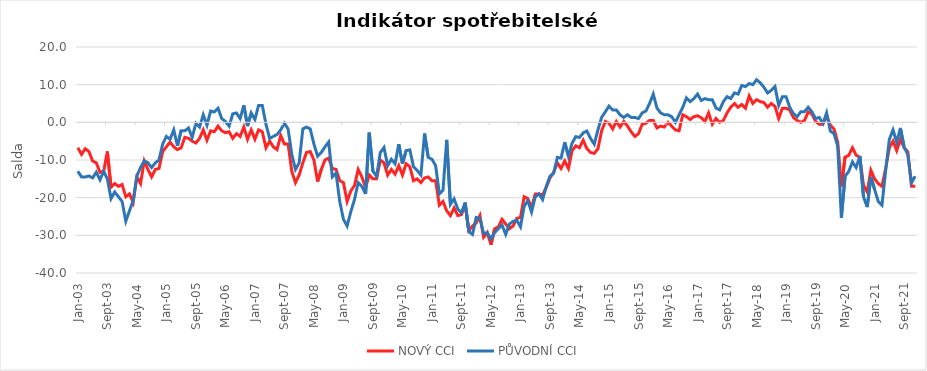
| Category | NOVÝ CCI | PŮVODNÍ CCI |
|---|---|---|
| 2003-01-01 | -6.75 | -13 |
| 2003-02-01 | -8.5 | -14.5 |
| 2003-03-01 | -7 | -14.5 |
| 2003-04-01 | -7.75 | -14.25 |
| 2003-05-01 | -10.25 | -14.75 |
| 2003-06-01 | -10.75 | -13.25 |
| 2003-07-01 | -13.25 | -15.25 |
| 2003-08-01 | -13 | -13 |
| 2003-09-01 | -7.75 | -15 |
| 2003-10-01 | -17.25 | -20.25 |
| 2003-11-01 | -16.25 | -18.5 |
| 2003-12-01 | -17 | -19.75 |
| 2004-01-01 | -16.5 | -21 |
| 2004-02-01 | -19.75 | -26.25 |
| 2004-03-01 | -19 | -23.5 |
| 2004-04-01 | -21.25 | -20.75 |
| 2004-05-01 | -14.5 | -14.25 |
| 2004-06-01 | -16.25 | -12 |
| 2004-07-01 | -10.25 | -10.25 |
| 2004-08-01 | -12.5 | -10.75 |
| 2004-09-01 | -14.5 | -12 |
| 2004-10-01 | -12.5 | -10.75 |
| 2004-11-01 | -12.25 | -10 |
| 2004-12-01 | -7.75 | -5.75 |
| 2005-01-01 | -6.5 | -3.75 |
| 2005-02-01 | -5.25 | -4.5 |
| 2005-03-01 | -6.5 | -2 |
| 2005-04-01 | -7.25 | -6.25 |
| 2005-05-01 | -6.75 | -2.25 |
| 2005-06-01 | -4 | -2.25 |
| 2005-07-01 | -4.25 | -1.5 |
| 2005-08-01 | -5 | -4 |
| 2005-09-01 | -5.5 | -0.25 |
| 2005-10-01 | -4.25 | -1.25 |
| 2005-11-01 | -2 | 2 |
| 2005-12-01 | -4.75 | -0.75 |
| 2006-01-01 | -2.25 | 3 |
| 2006-02-01 | -2.5 | 2.75 |
| 2006-03-01 | -1 | 3.75 |
| 2006-04-01 | -2.25 | 1 |
| 2006-05-01 | -2.75 | 0.25 |
| 2006-06-01 | -2.5 | -1 |
| 2006-07-01 | -4.25 | 2.25 |
| 2006-08-01 | -3 | 2.5 |
| 2006-09-01 | -3.75 | 1 |
| 2006-10-01 | -1.25 | 4.5 |
| 2006-11-01 | -4.5 | -1 |
| 2006-12-01 | -2 | 2.5 |
| 2007-01-01 | -4.5 | 0.75 |
| 2007-02-01 | -2 | 4.5 |
| 2007-03-01 | -2.5 | 4.5 |
| 2007-04-01 | -6.75 | -0.5 |
| 2007-05-01 | -5 | -4.25 |
| 2007-06-01 | -6.5 | -3.75 |
| 2007-07-01 | -7.25 | -3.25 |
| 2007-08-01 | -3.5 | -2 |
| 2007-09-01 | -5.75 | -0.25 |
| 2007-10-01 | -5.75 | -1.75 |
| 2007-11-01 | -13 | -8.5 |
| 2007-12-01 | -16 | -12.5 |
| 2008-01-01 | -14 | -10.75 |
| 2008-02-01 | -10.75 | -1.75 |
| 2008-03-01 | -8 | -1.25 |
| 2008-04-01 | -7.75 | -1.75 |
| 2008-05-01 | -10 | -5.75 |
| 2008-06-01 | -15.75 | -9 |
| 2008-07-01 | -12.5 | -8 |
| 2008-08-01 | -10 | -6.5 |
| 2008-09-01 | -9.5 | -5.25 |
| 2008-10-01 | -12.25 | -14.5 |
| 2008-11-01 | -12.5 | -13.5 |
| 2008-12-01 | -15.5 | -21 |
| 2009-01-01 | -16 | -25.75 |
| 2009-02-01 | -21 | -27.5 |
| 2009-03-01 | -18.25 | -23.75 |
| 2009-04-01 | -16.75 | -20.5 |
| 2009-05-01 | -12.5 | -16 |
| 2009-06-01 | -14.5 | -17 |
| 2009-07-01 | -17.25 | -19 |
| 2009-08-01 | -14 | -2.75 |
| 2009-09-01 | -15 | -13 |
| 2009-10-01 | -15 | -14.3 |
| 2009-11-01 | -10 | -8 |
| 2009-12-01 | -10.75 | -6.7 |
| 2010-01-01 | -14 | -11.5 |
| 2010-02-01 | -12.5 | -9.8 |
| 2010-03-01 | -13.75 | -11 |
| 2010-04-01 | -11.5 | -5.8 |
| 2010-05-01 | -14 | -11 |
| 2010-06-01 | -11 | -7.5 |
| 2010-07-01 | -11.75 | -7.3 |
| 2010-08-01 | -15.5 | -11.8 |
| 2010-09-01 | -15 | -12.8 |
| 2010-10-01 | -16 | -14 |
| 2010-11-01 | -14.75 | -2.984 |
| 2010-12-01 | -14.5 | -9.3 |
| 2011-01-01 | -15.5 | -9.8 |
| 2011-02-01 | -15.5 | -11.5 |
| 2011-03-01 | -22 | -19 |
| 2011-04-01 | -21 | -18 |
| 2011-05-01 | -23.5 | -4.656 |
| 2011-06-01 | -24.75 | -21.8 |
| 2011-07-01 | -22.75 | -20.3 |
| 2011-08-01 | -24.75 | -23 |
| 2011-09-01 | -24.5 | -24 |
| 2011-10-01 | -21.75 | -21.3 |
| 2011-11-01 | -28.75 | -29 |
| 2011-12-01 | -27.5 | -29.75 |
| 2012-01-01 | -26.75 | -25.25 |
| 2012-02-01 | -24.75 | -25.5 |
| 2012-03-01 | -30.5 | -29.5 |
| 2012-04-01 | -29.25 | -29.3 |
| 2012-05-01 | -32.5 | -31 |
| 2012-06-01 | -28.25 | -29.25 |
| 2012-07-01 | -27.75 | -28.25 |
| 2012-08-01 | -25.75 | -27.25 |
| 2012-09-01 | -27 | -29.75 |
| 2012-10-01 | -28.25 | -27 |
| 2012-11-01 | -27.5 | -26.3 |
| 2012-12-01 | -25.5 | -26 |
| 2013-01-01 | -25.25 | -27.75 |
| 2013-02-01 | -19.75 | -22.3 |
| 2013-03-01 | -20.25 | -20.8 |
| 2013-04-01 | -22.75 | -23.8 |
| 2013-05-01 | -19 | -19.8 |
| 2013-06-01 | -19 | -19 |
| 2013-07-01 | -19.25 | -20.5 |
| 2013-08-01 | -17.25 | -17 |
| 2013-09-01 | -14.75 | -14.3 |
| 2013-10-01 | -13.25 | -13.5 |
| 2013-11-01 | -10.75 | -9.3 |
| 2013-12-01 | -12.25 | -9.5 |
| 2014-01-01 | -10.25 | -5.3 |
| 2014-02-01 | -12.25 | -9 |
| 2014-03-01 | -7.5 | -5.5 |
| 2014-04-01 | -6.25 | -3.8 |
| 2014-05-01 | -6.75 | -4 |
| 2014-06-01 | -4.75 | -2.8 |
| 2014-07-01 | -7 | -2.3 |
| 2014-08-01 | -8 | -4.3 |
| 2014-09-01 | -8.25 | -5.8 |
| 2014-10-01 | -7 | -2 |
| 2014-11-01 | -2.25 | 1.3 |
| 2014-12-01 | 0.25 | 2.8 |
| 2015-01-01 | -0.25 | 4.3 |
| 2015-02-01 | -1.75 | 3.3 |
| 2015-03-01 | 0.25 | 3.3 |
| 2015-04-01 | -1.25 | 2 |
| 2015-05-01 | 0.25 | 1.3 |
| 2015-06-01 | -1 | 2 |
| 2015-07-01 | -2.5 | 1.3 |
| 2015-08-01 | -3.75 | 1.3 |
| 2015-09-01 | -3 | 1 |
| 2015-10-01 | -0.5 | 2.5 |
| 2015-11-01 | -0.25 | 3 |
| 2015-12-01 | 0.5 | 5 |
| 2016-01-01 | 0.5 | 7.5 |
| 2016-02-01 | -1.5 | 3.8 |
| 2016-03-01 | -1 | 2.5 |
| 2016-04-01 | -1.25 | 2 |
| 2016-05-01 | 0 | 2 |
| 2016-06-01 | -1 | 1.5 |
| 2016-07-01 | -2 | 0 |
| 2016-08-01 | -2.25 | 2 |
| 2016-09-01 | 2 | 4 |
| 2016-10-01 | 1.5 | 6.5 |
| 2016-11-01 | 0.75 | 5.5 |
| 2016-12-01 | 1.5 | 6.3 |
| 2017-01-01 | 1.75 | 7.5 |
| 2017-02-01 | 1.25 | 5.8 |
| 2017-03-01 | 0.25 | 6.3 |
| 2017-04-01 | 2.5 | 6 |
| 2017-05-01 | -0.5 | 6 |
| 2017-06-01 | 1 | 3.8 |
| 2017-07-01 | 0 | 3.3 |
| 2017-08-01 | 0.5 | 5.5 |
| 2017-09-01 | 2.5 | 6.8 |
| 2017-10-01 | 4 | 6.3 |
| 2017-11-01 | 5 | 7.8 |
| 2017-12-01 | 4 | 7.5 |
| 2018-01-01 | 4.75 | 9.8 |
| 2018-02-01 | 3.75 | 9.5 |
| 2018-03-01 | 7 | 10.3 |
| 2018-04-01 | 5 | 10 |
| 2018-05-01 | 6 | 11.3 |
| 2018-06-01 | 5.5 | 10.5 |
| 2018-07-01 | 5.25 | 9.3 |
| 2018-08-01 | 4 | 7.8 |
| 2018-09-01 | 5 | 8.5 |
| 2018-10-01 | 4.25 | 9.5 |
| 2018-11-01 | 1 | 4.5 |
| 2018-12-01 | 3.75 | 6.8 |
| 2019-01-01 | 3.75 | 6.8 |
| 2019-02-01 | 3.25 | 4 |
| 2019-03-01 | 1.25 | 2.3 |
| 2019-04-01 | 0.5 | 1.5 |
| 2019-05-01 | 0 | 2.8 |
| 2019-06-01 | 0.5 | 2.8 |
| 2019-07-01 | 2.75 | 4 |
| 2019-08-01 | 2.25 | 2.8 |
| 2019-09-01 | 0.25 | 1 |
| 2019-10-01 | -0.5 | 1.3 |
| 2019-11-01 | -0.5 | -0.3 |
| 2019-12-01 | 1.75 | 2.5 |
| 2020-01-01 | -0.75 | -2.3 |
| 2020-02-01 | -1.75 | -3 |
| 2020-03-01 | -5.25 | -6.3 |
| 2020-04-01 | -17 | -25.3 |
| 2020-05-01 | -9.25 | -14.3 |
| 2020-06-01 | -8.75 | -13 |
| 2020-07-01 | -6.75 | -10.5 |
| 2020-08-01 | -8.75 | -12 |
| 2020-09-01 | -9.25 | -9 |
| 2020-10-01 | -16.75 | -19.8 |
| 2020-11-01 | -18.5 | -22.5 |
| 2020-12-01 | -12.75 | -14.5 |
| 2021-01-01 | -15 | -17.8 |
| 2021-02-01 | -16.25 | -21 |
| 2021-03-01 | -17 | -22 |
| 2021-04-01 | -12.25 | -12.8 |
| 2021-05-01 | -6.75 | -4.5 |
| 2021-06-01 | -5 | -2 |
| 2021-07-01 | -7.5 | -5.3 |
| 2021-08-01 | -4.5 | -1.5 |
| 2021-09-01 | -6.75 | -6.5 |
| 2021-10-01 | -7.8 | -8.5 |
| 2021-11-01 | -17 | -16 |
| 2021-12-01 | -17 | -14.3 |